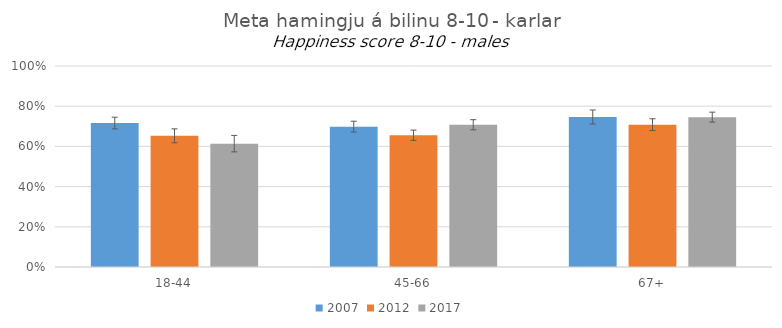
| Category | 2007 | 2012 | 2017 |
|---|---|---|---|
| 18-44 | 0.716 | 0.653 | 0.614 |
| 45-66 | 0.698 | 0.655 | 0.708 |
| 67+ | 0.746 | 0.708 | 0.746 |